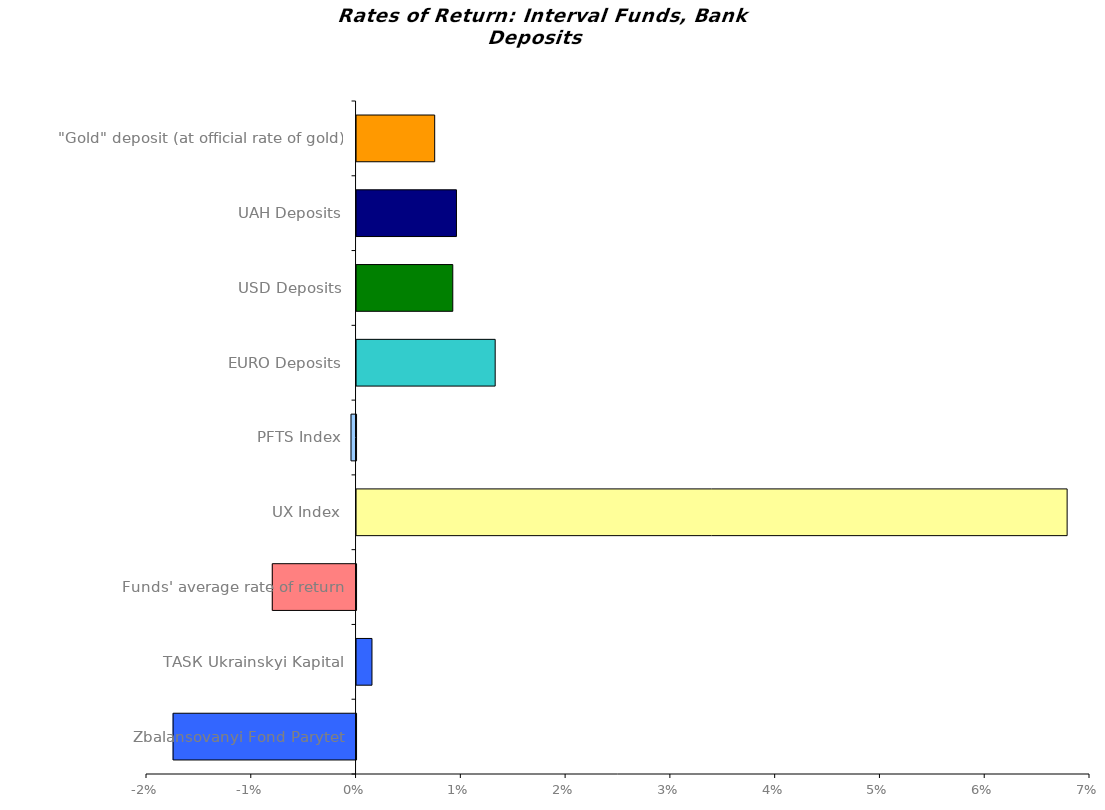
| Category | Series 0 |
|---|---|
| Zbalansovanyi Fond Parytet | -0.017 |
| ТАSК Ukrainskyi Kapital | 0.001 |
| Funds' average rate of return | -0.008 |
| UX Index | 0.068 |
| PFTS Index | 0 |
| EURO Deposits | 0.013 |
| USD Deposits | 0.009 |
| UAH Deposits | 0.01 |
| "Gold" deposit (at official rate of gold) | 0.007 |